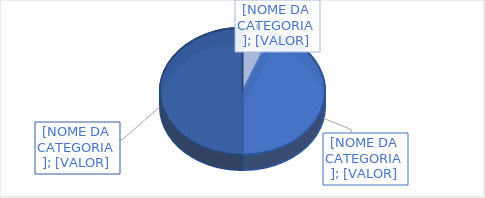
| Category | Series 0 |
|---|---|
| Clínica médica | 67 |
| Clinica cirúrgica | 502 |
| Total | 569 |